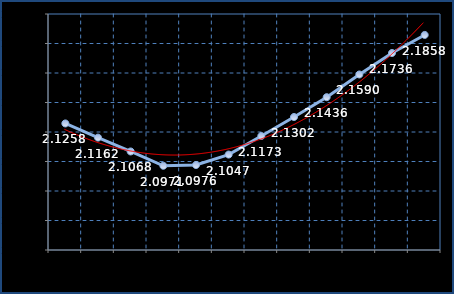
| Category | Series 0 |
|---|---|
| Jan 15 | 2.126 |
| Feb 15 | 2.116 |
| Mar 15 | 2.107 |
| Apr 15 | 2.097 |
| May 15 | 2.098 |
| Jun 15 | 2.105 |
| Jul 15 | 2.117 |
| Aug 15 | 2.13 |
| Sep 15 | 2.144 |
| Oct 15 | 2.159 |
| Nov 15 | 2.174 |
| Dec 15 | 2.186 |